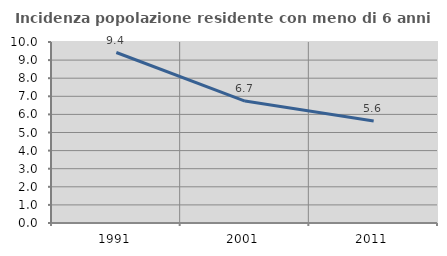
| Category | Incidenza popolazione residente con meno di 6 anni |
|---|---|
| 1991.0 | 9.419 |
| 2001.0 | 6.737 |
| 2011.0 | 5.635 |